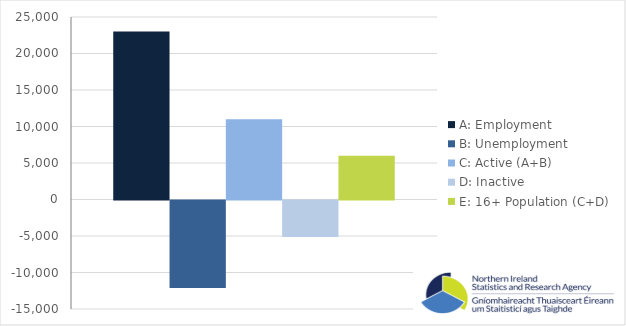
| Category | A: Employment | B: Unemployment | C: Active (A+B) | D: Inactive | E: 16+ Population (C+D) |
|---|---|---|---|---|---|
| 0 | 23000 | -12000 | 11000 | -5000 | 6000 |